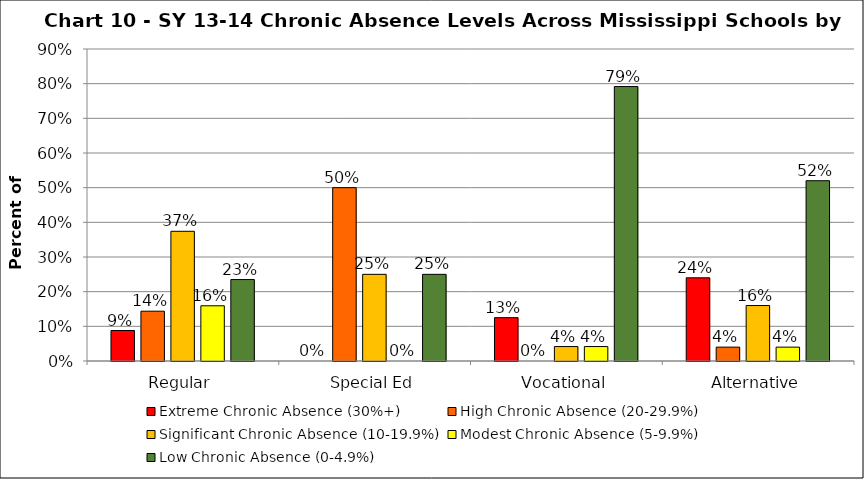
| Category | Extreme Chronic Absence (30%+) | High Chronic Absence (20-29.9%) | Significant Chronic Absence (10-19.9%) | Modest Chronic Absence (5-9.9%) | Low Chronic Absence (0-4.9%) |
|---|---|---|---|---|---|
| 0 | 0.088 | 0.144 | 0.374 | 0.159 | 0.235 |
| 1 | 0 | 0.5 | 0.25 | 0 | 0.25 |
| 2 | 0.125 | 0 | 0.042 | 0.042 | 0.792 |
| 3 | 0.24 | 0.04 | 0.16 | 0.04 | 0.52 |